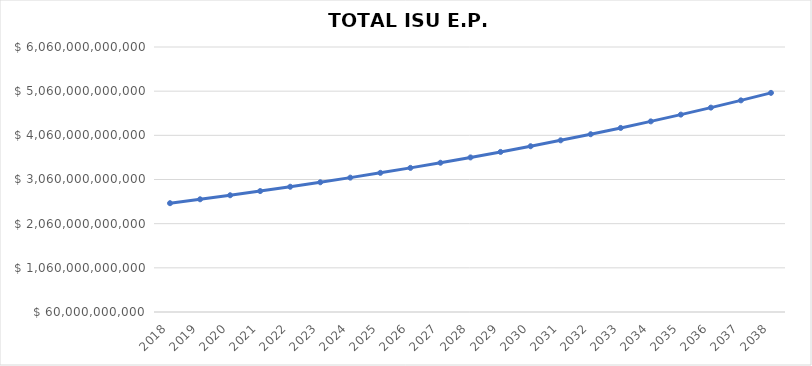
| Category | TOTAL ISU E.P. |
|---|---|
| 2018.0 | 2523590253500 |
| 2019.0 | 2611915912372.5 |
| 2020.0 | 2703332969305.537 |
| 2021.0 | 2797949623231.23 |
| 2022.0 | 2895877860044.323 |
| 2023.0 | 2997233585145.874 |
| 2024.0 | 3102136760625.98 |
| 2025.0 | 3210711547247.889 |
| 2026.0 | 3323086451401.565 |
| 2027.0 | 3439394477200.62 |
| 2028.0 | 3559773283902.641 |
| 2029.0 | 3684365348839.234 |
| 2030.0 | 3813318136048.606 |
| 2031.0 | 3946784270810.307 |
| 2032.0 | 4084921720288.668 |
| 2033.0 | 4227893980498.77 |
| 2034.0 | 4375870269816.227 |
| 2035.0 | 4529025729259.795 |
| 2036.0 | 4687541629783.888 |
| 2037.0 | 4851605586826.323 |
| 2038.0 | 5021411782365.244 |